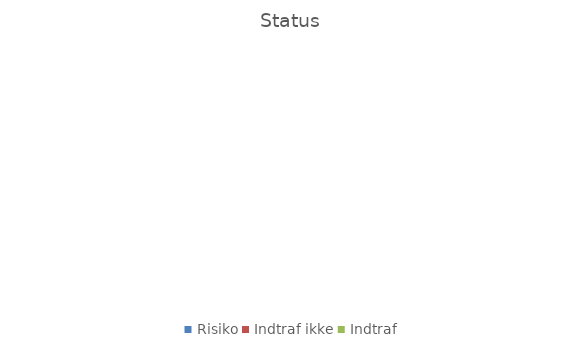
| Category | Status |
|---|---|
| Risiko | 0 |
| Indtraf ikke | 0 |
| Indtraf | 0 |